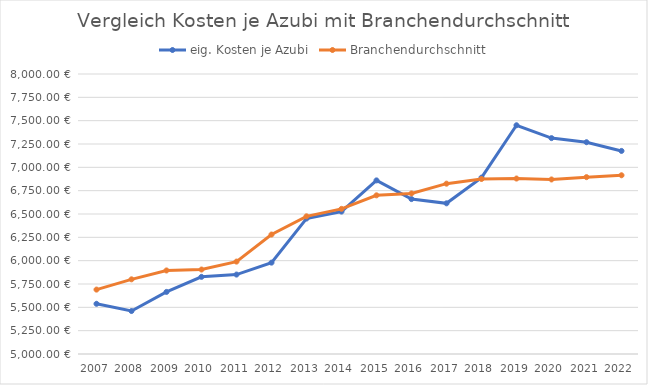
| Category | eig. Kosten je Azubi | Branchendurchschnitt |
|---|---|---|
| 2007.0 | 5537.917 | 5690 |
| 2008.0 | 5460.455 | 5800 |
| 2009.0 | 5665.2 | 5895 |
| 2010.0 | 5826.6 | 5905 |
| 2011.0 | 5851.077 | 5990 |
| 2012.0 | 5978.846 | 6280 |
| 2013.0 | 6451.312 | 6475 |
| 2014.0 | 6525.875 | 6555 |
| 2015.0 | 6860.067 | 6700 |
| 2016.0 | 6659.75 | 6720 |
| 2017.0 | 6614.353 | 6825 |
| 2018.0 | 6889.474 | 6875 |
| 2019.0 | 7450.857 | 6880 |
| 2020.0 | 7313.111 | 6870 |
| 2021.0 | 7269.158 | 6895 |
| 2022.0 | 7175.789 | 6915 |